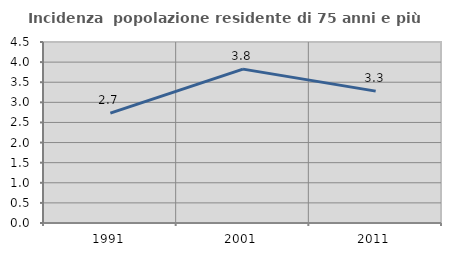
| Category | Incidenza  popolazione residente di 75 anni e più |
|---|---|
| 1991.0 | 2.731 |
| 2001.0 | 3.826 |
| 2011.0 | 3.279 |